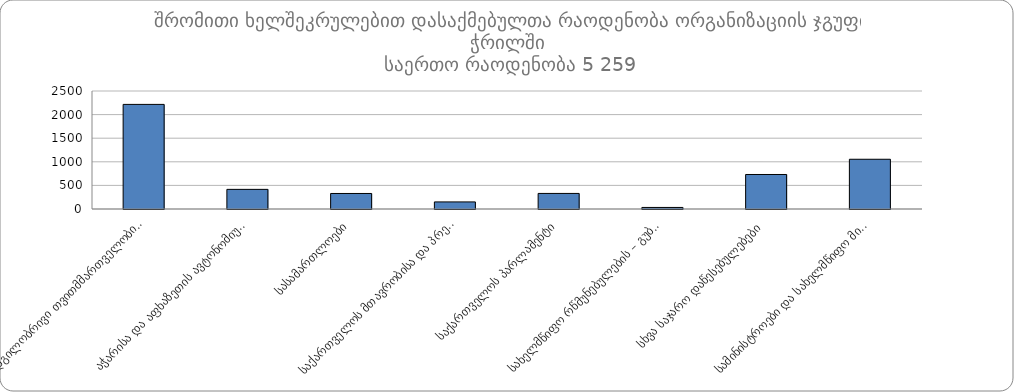
| Category | ჯამი |
|---|---|
|  ადგილობრივი თვითმმართველობის ორგანოები | 2216 |
|  აჭარისა და აფხაზეთის ავტონომიური რესპუბლიკები | 416 |
|  სასამართლოები | 329 |
|  საქართველოს მთავრობისა და პრეზიდენტის ადმინისტრაციები | 150 |
|  საქართველოს პარლამენტი | 330 |
|  სახელმწიფო რწმუნებულების – გუბერნატორების ადმინისტრაციები | 33 |
|  სხვა საჯარო დაწესებულებები | 731 |
|  სამინისტროები და სახელმწიფო მინისტრების აპარატი | 1054 |